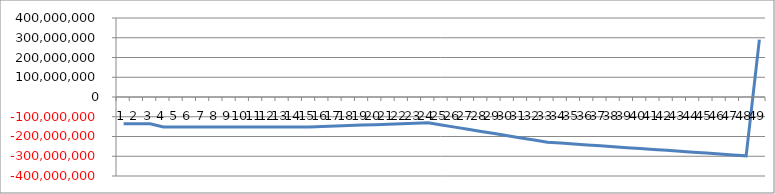
| Category | Series 0 |
|---|---|
| 0 | -135587533.993 |
| 1 | -135587533.993 |
| 2 | -135587533.993 |
| 3 | -151438692.456 |
| 4 | -151438692.456 |
| 5 | -151438692.456 |
| 6 | -151438692.456 |
| 7 | -151438692.456 |
| 8 | -151438692.456 |
| 9 | -151438692.456 |
| 10 | -151438692.456 |
| 11 | -151438692.456 |
| 12 | -151438692.456 |
| 13 | -151438692.456 |
| 14 | -151438692.456 |
| 15 | -149138900.225 |
| 16 | -146839107.994 |
| 17 | -144539315.764 |
| 18 | -142239523.533 |
| 19 | -139939731.302 |
| 20 | -137639939.071 |
| 21 | -135340146.84 |
| 22 | -133040354.61 |
| 23 | -130740562.379 |
| 24 | -141650068.867 |
| 25 | -152559575.355 |
| 26 | -163469081.843 |
| 27 | -174378588.331 |
| 28 | -185288094.82 |
| 29 | -196197601.308 |
| 30 | -207107107.796 |
| 31 | -218016614.284 |
| 32 | -228926120.772 |
| 33 | -233511198.626 |
| 34 | -238096276.479 |
| 35 | -242681354.333 |
| 36 | -247266432.186 |
| 37 | -251851510.04 |
| 38 | -256436587.893 |
| 39 | -261021665.746 |
| 40 | -265606743.6 |
| 41 | -270191821.453 |
| 42 | -274776899.307 |
| 43 | -279361977.16 |
| 44 | -283947055.014 |
| 45 | -288532132.867 |
| 46 | -293117210.721 |
| 47 | -297702288.574 |
| 48 | 290469574.45 |